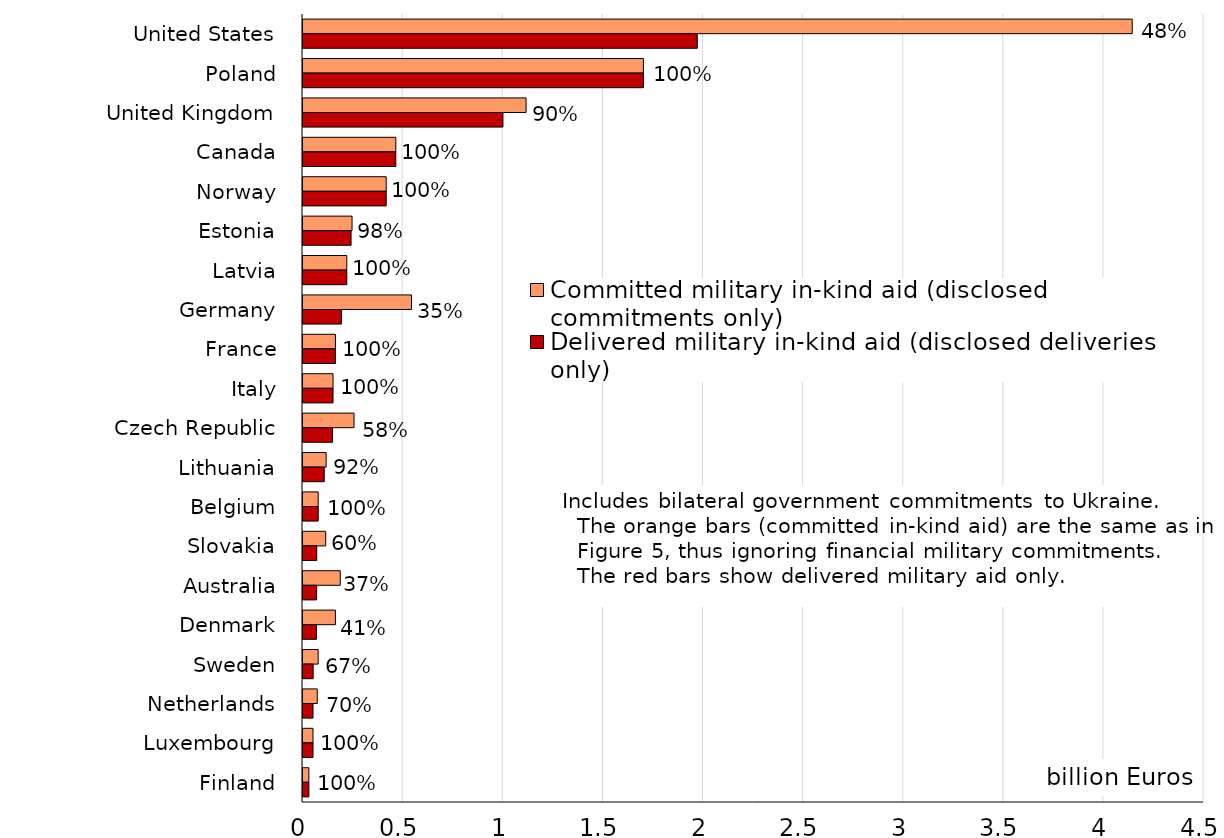
| Category | Committed military in-kind aid (disclosed commitments only) | Delivered military in-kind aid (disclosed deliveries only) |
|---|---|---|
| United States | 4.142 | 1.969 |
| Poland | 1.7 | 1.7 |
| United Kingdom | 1.114 | 0.999 |
| Canada | 0.464 | 0.464 |
| Norway | 0.415 | 0.415 |
| Estonia | 0.245 | 0.24 |
| Latvia | 0.219 | 0.219 |
| Germany | 0.542 | 0.192 |
| France | 0.162 | 0.162 |
| Italy | 0.15 | 0.15 |
| Czech Republic | 0.255 | 0.148 |
| Lithuania | 0.115 | 0.106 |
| Belgium | 0.076 | 0.076 |
| Slovakia | 0.113 | 0.069 |
| Australia | 0.186 | 0.068 |
| Denmark | 0.162 | 0.067 |
| Sweden | 0.076 | 0.051 |
| Netherlands | 0.071 | 0.05 |
| Luxembourg | 0.05 | 0.05 |
| Finland | 0.029 | 0.029 |